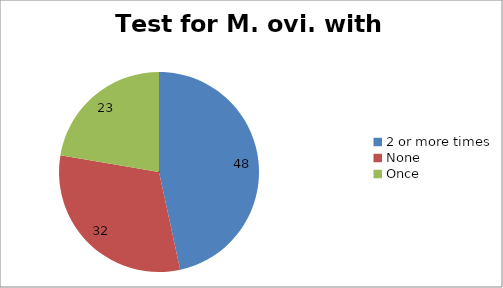
| Category | Series 0 |
|---|---|
| 2 or more times | 48 |
| None | 32 |
| Once | 23 |